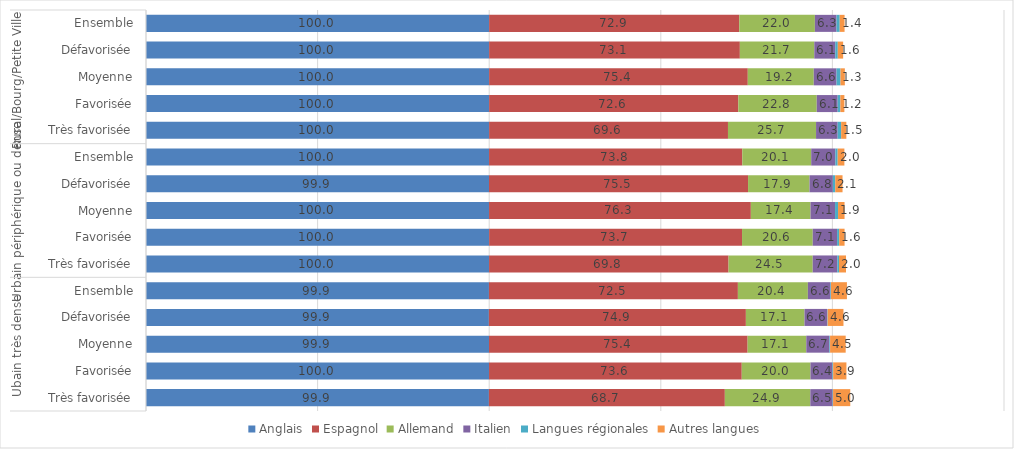
| Category | Anglais | Espagnol | Allemand | Italien | Langues régionales | Autres langues |
|---|---|---|---|---|---|---|
| 0 | 99.978 | 72.889 | 22.033 | 6.311 | 0.926 | 1.408 |
| 1 | 99.978 | 73.057 | 21.687 | 6.116 | 0.733 | 1.559 |
| 2 | 99.978 | 75.372 | 19.218 | 6.638 | 1.146 | 1.276 |
| 3 | 99.979 | 72.609 | 22.847 | 6.099 | 0.781 | 1.177 |
| 4 | 99.975 | 69.598 | 25.664 | 6.303 | 1.011 | 1.514 |
| 5 | 99.958 | 73.783 | 20.084 | 7.044 | 0.671 | 1.954 |
| 6 | 99.945 | 75.48 | 17.914 | 6.79 | 0.7 | 2.124 |
| 7 | 99.954 | 76.285 | 17.385 | 7.149 | 0.869 | 1.9 |
| 8 | 99.98 | 73.689 | 20.603 | 7.093 | 0.605 | 1.578 |
| 9 | 99.962 | 69.781 | 24.519 | 7.175 | 0.49 | 2.037 |
| 10 | 99.928 | 72.536 | 20.391 | 6.572 | 0.164 | 4.646 |
| 11 | 99.911 | 74.882 | 17.072 | 6.622 | 0.133 | 4.606 |
| 12 | 99.946 | 75.353 | 17.089 | 6.73 | 0.205 | 4.548 |
| 13 | 99.952 | 73.638 | 20.015 | 6.388 | 0.226 | 3.868 |
| 14 | 99.919 | 68.743 | 24.899 | 6.5 | 0.135 | 5.01 |